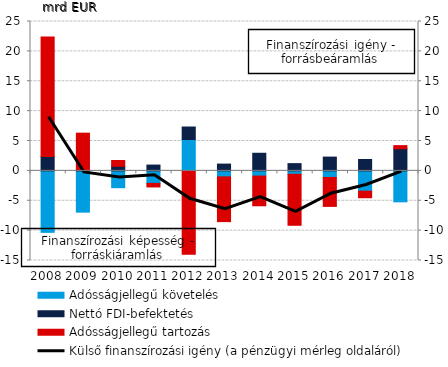
| Category | Adósságjellegű követelés | Nettó FDI-befektetés | Adósságjellegű tartozás |
|---|---|---|---|
| 2008.0 | -10.29 | 2.411 | 19.98 |
| 2009.0 | -6.907 | 0.153 | 6.158 |
| 2010.0 | -2.818 | 0.762 | 0.977 |
| 2011.0 | -2.093 | 0.972 | -0.595 |
| 2012.0 | 5.246 | 2.095 | -13.959 |
| 2013.0 | -1.003 | 1.138 | -7.489 |
| 2014.0 | -0.87 | 2.948 | -4.971 |
| 2015.0 | -0.567 | 1.213 | -8.537 |
| 2016.0 | -1.102 | 2.307 | -4.84 |
| 2017.0 | -3.398 | 1.901 | -1.095 |
| 2018.0 | -5.18 | 3.702 | 0.524 |